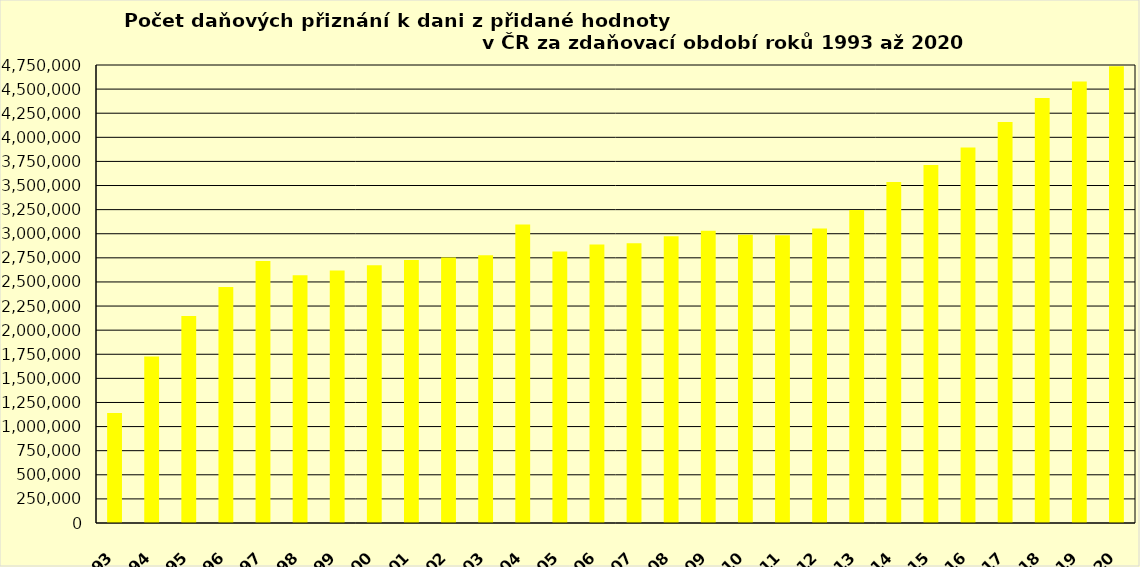
| Category | Series 0 |
|---|---|
| 1993 | 1140755 |
| 1994 | 1727290 |
| 1995 | 2147169 |
| 1996 | 2448436 |
| 1997 | 2716250 |
| 1998 | 2568304 |
| 1999 | 2617628 |
| 2000 | 2673355 |
| 2001 | 2727115 |
| 2002 | 2753616 |
| 2003 | 2776783 |
| 2004 | 3094611 |
| 2005 | 2816384 |
| 2006 | 2887845 |
| 2007 | 2902614 |
| 2008 | 2975122 |
| 2009 | 3030894 |
| 2010 | 2990251 |
| 2011 | 2985376 |
| 2012 | 3053582 |
| 2013 | 3245327 |
| 2014 | 3536745 |
| 2015 | 3713114 |
| 2016 | 3893670 |
| 2017 | 4158615 |
| 2018 | 4407262 |
| 2019 | 4580153 |
| 2020 | 4736386 |